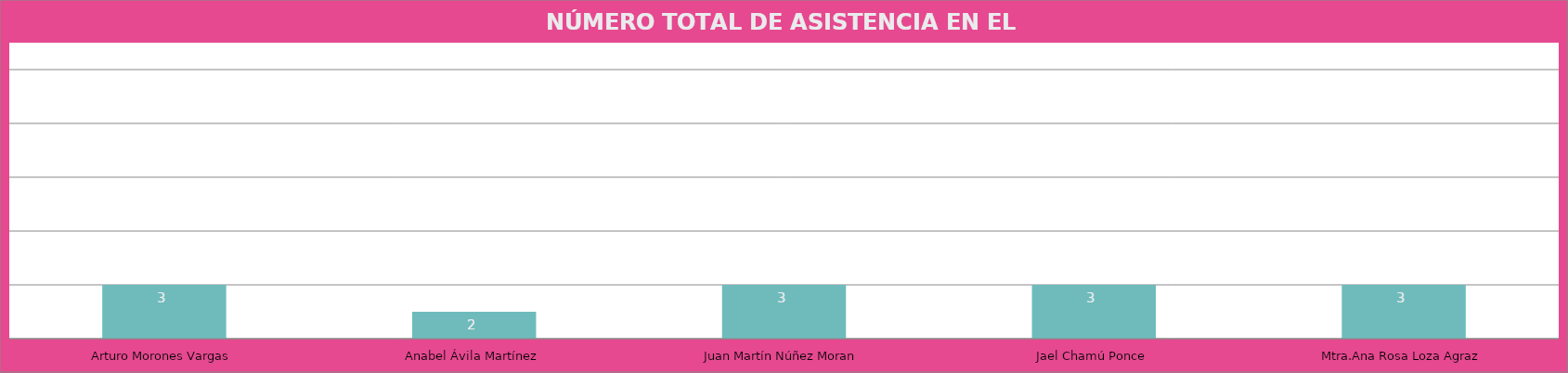
| Category | Arturo Morones Vargas |
|---|---|
| Arturo Morones Vargas | 3 |
| Anabel Ávila Martínez | 2 |
| Juan Martín Núñez Moran | 3 |
| Jael Chamú Ponce | 3 |
| Mtra.Ana Rosa Loza Agraz | 3 |